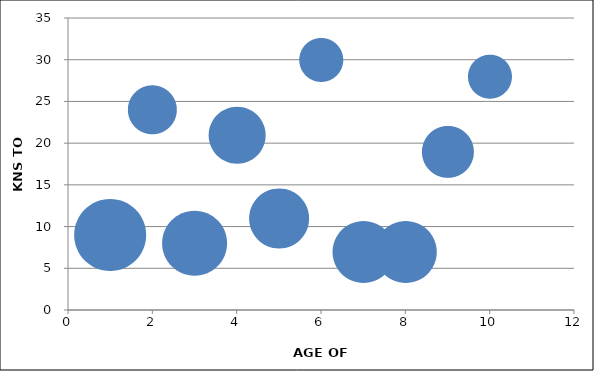
| Category | Series 0 |
|---|---|
| 1.0 | 9 |
| 2.0 | 24 |
| 3.0 | 8 |
| 4.0 | 21 |
| 5.0 | 11 |
| 6.0 | 30 |
| 7.0 | 7 |
| 8.0 | 7 |
| 9.0 | 19 |
| 10.0 | 28 |